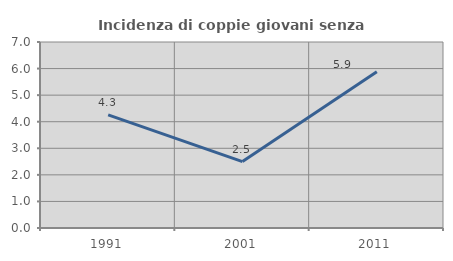
| Category | Incidenza di coppie giovani senza figli |
|---|---|
| 1991.0 | 4.255 |
| 2001.0 | 2.5 |
| 2011.0 | 5.882 |